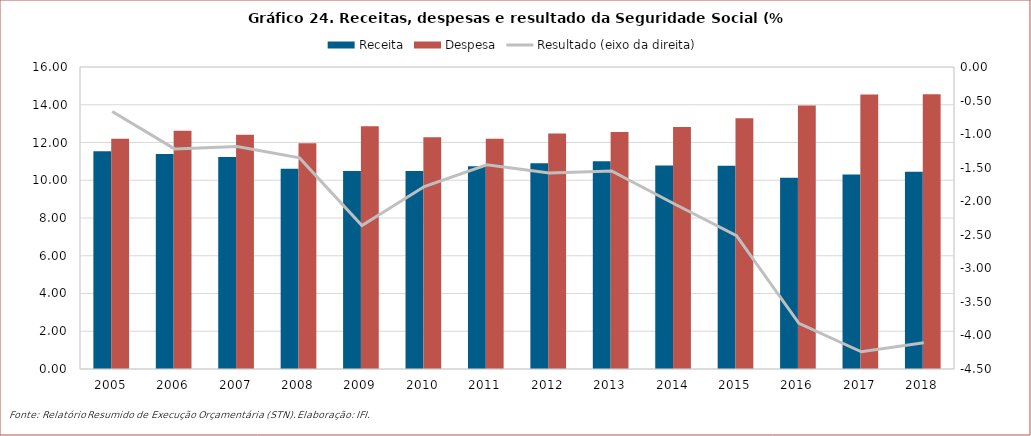
| Category | Receita | Despesa |
|---|---|---|
| 2005.0 | 11.538 | 12.202 |
| 2006.0 | 11.397 | 12.617 |
| 2007.0 | 11.233 | 12.417 |
| 2008.0 | 10.611 | 11.965 |
| 2009.0 | 10.496 | 12.857 |
| 2010.0 | 10.496 | 12.278 |
| 2011.0 | 10.744 | 12.2 |
| 2012.0 | 10.902 | 12.481 |
| 2013.0 | 11.001 | 12.552 |
| 2014.0 | 10.78 | 12.817 |
| 2015.0 | 10.774 | 13.286 |
| 2016.0 | 10.137 | 13.957 |
| 2017.0 | 10.303 | 14.546 |
| 2018.0 | 10.444 | 14.555 |